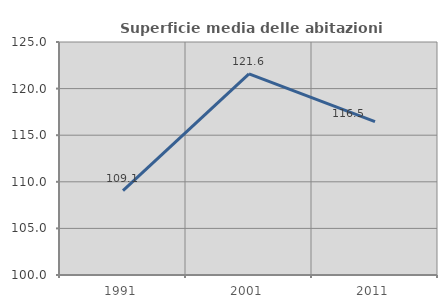
| Category | Superficie media delle abitazioni occupate |
|---|---|
| 1991.0 | 109.06 |
| 2001.0 | 121.575 |
| 2011.0 | 116.451 |